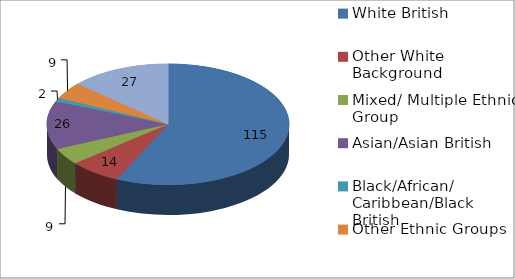
| Category | Series 0 |
|---|---|
| White British | 115 |
| Other White Background | 14 |
| Mixed/ Multiple Ethnic Group | 9 |
| Asian/Asian British | 26 |
| Black/African/  Caribbean/Black British | 2 |
| Other Ethnic Groups | 9 |
| No response | 27 |